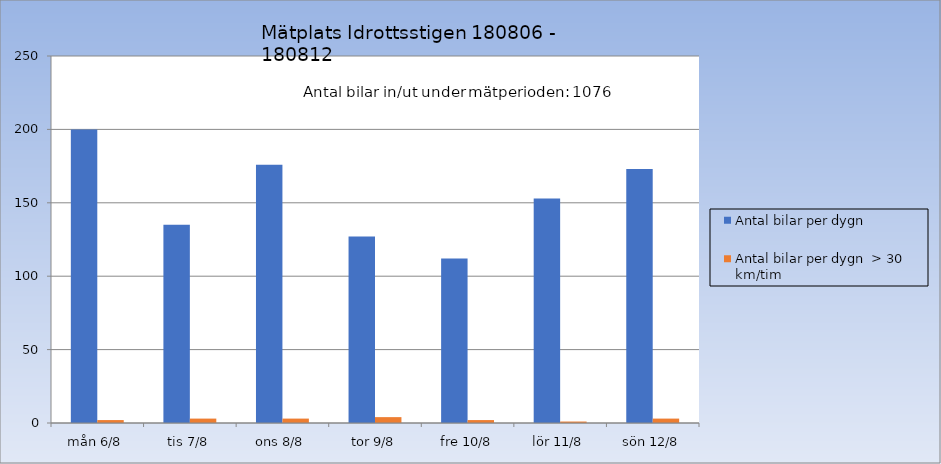
| Category | Antal bilar per dygn | Antal bilar per dygn  > 30 km/tim |
|---|---|---|
| mån 6/8 | 200 | 2 |
| tis 7/8 | 135 | 3 |
| ons 8/8 | 176 | 3 |
| tor 9/8 | 127 | 4 |
| fre 10/8 | 112 | 2 |
| lör 11/8 | 153 | 1 |
| sön 12/8 | 173 | 3 |